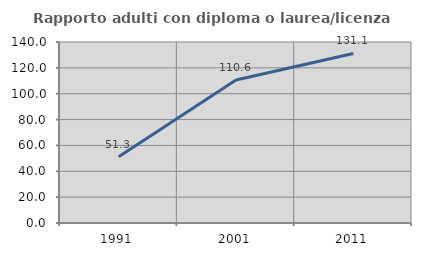
| Category | Rapporto adulti con diploma o laurea/licenza media  |
|---|---|
| 1991.0 | 51.25 |
| 2001.0 | 110.632 |
| 2011.0 | 131.129 |